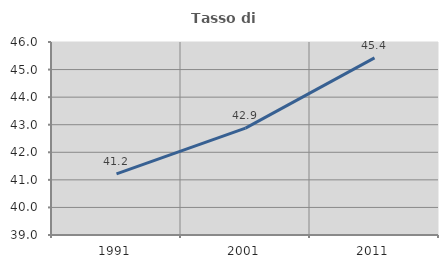
| Category | Tasso di occupazione   |
|---|---|
| 1991.0 | 41.22 |
| 2001.0 | 42.878 |
| 2011.0 | 45.425 |